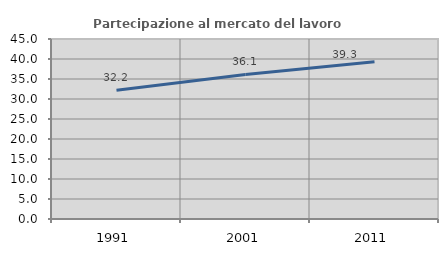
| Category | Partecipazione al mercato del lavoro  femminile |
|---|---|
| 1991.0 | 32.21 |
| 2001.0 | 36.126 |
| 2011.0 | 39.311 |